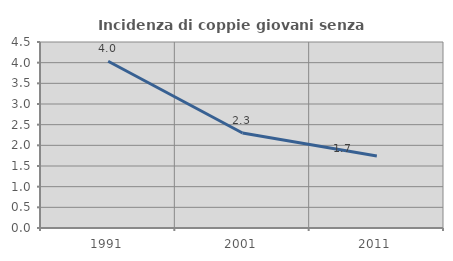
| Category | Incidenza di coppie giovani senza figli |
|---|---|
| 1991.0 | 4.035 |
| 2001.0 | 2.299 |
| 2011.0 | 1.744 |